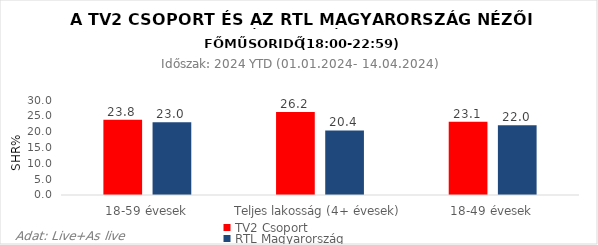
| Category | TV2 Csoport | RTL Magyarország |
|---|---|---|
| 18-59 évesek | 23.8 | 23 |
| Teljes lakosság (4+ évesek) | 26.2 | 20.4 |
| 18-49 évesek | 23.1 | 22 |